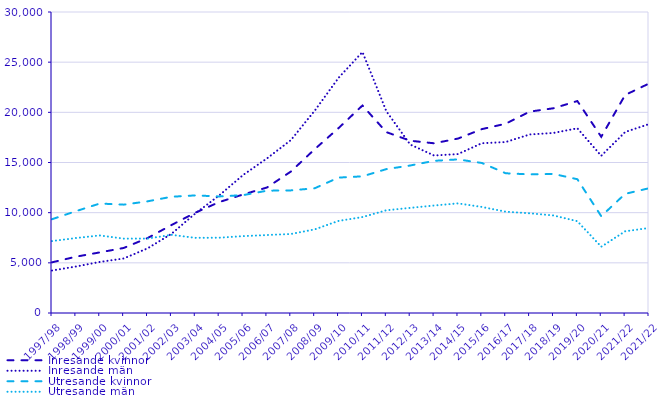
| Category | Inresande kvinnor | Inresande män | Utresande kvinnor | Utresande män |
|---|---|---|---|---|
| 1997/98 | 5050 | 4232 | 9348 | 7166 |
| 1998/99 | 5610 | 4630 | 10145 | 7471 |
| 1999/00 | 6040 | 5089 | 10911 | 7729 |
| 2000/01 | 6481 | 5432 | 10800 | 7412 |
| 2001/02 | 7466 | 6440 | 11128 | 7417 |
| 2002/03 | 8765 | 7884 | 11585 | 7792 |
| 2003/04 | 9993 | 9917 | 11720 | 7491 |
| 2004/05 | 11054 | 11715 | 11616 | 7505 |
| 2005/06 | 11812 | 13746 | 11747 | 7660 |
| 2006/07 | 12506 | 15405 | 12189 | 7770 |
| 2007/08 | 14094 | 17222 | 12220 | 7873 |
| 2008/09 | 16324 | 20161 | 12430 | 8334 |
| 2009/10 | 18430 | 23439 | 13496 | 9178 |
| 2010/11 | 20679 | 26009 | 13620 | 9561 |
| 2011/12 | 18030 | 20115 | 14339 | 10238 |
| 2012/13 | 17171 | 16793 | 14701 | 10478 |
| 2013/14 | 16915 | 15698 | 15164 | 10711 |
| 2014/15 | 17385 | 15839 | 15309 | 10926 |
| 2015/16 | 18326 | 16920 | 14953 | 10570 |
| 2016/17 | 18865 | 17040 | 13926 | 10098 |
| 2017/18 | 20068 | 17792 | 13817 | 9938 |
| 2018/19 | 20406 | 17944 | 13861 | 9723 |
| 2019/20 | 21126 | 18411 | 13332 | 9147 |
| 2020/21 | 17559 | 15666 | 9647 | 6603 |
| 2021/22 | 21727 | 18035 | 11875 | 8142 |
| 2021/22 | 22871 | 18828 | 12435 | 8475 |